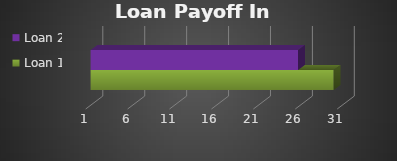
| Category | Loan 1 | Loan 2 |
|---|---|---|
| 0 | 30 | 25.75 |